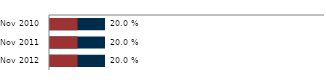
| Category | Global stunting | Severe stunting |
|---|---|---|
| 2010-11-01 | 0.2 | 0.1 |
| 2011-11-01 | 0.2 | 0.1 |
| 2012-11-01 | 0.2 | 0.1 |